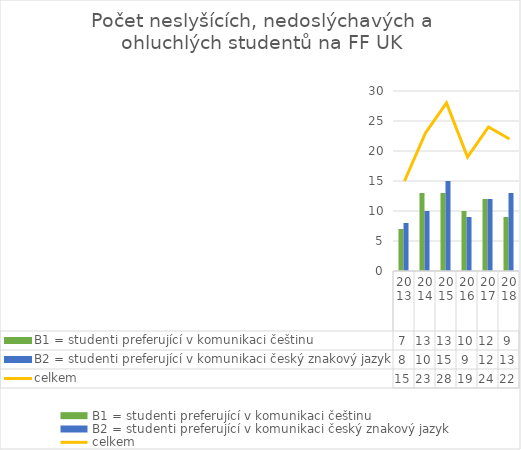
| Category | B1 = studenti preferující v komunikaci češtinu | B2 = studenti preferující v komunikaci český znakový jazyk |
|---|---|---|
| 2013.0 | 7 | 8 |
| 2014.0 | 13 | 10 |
| 2015.0 | 13 | 15 |
| 2016.0 | 10 | 9 |
| 2017.0 | 12 | 12 |
| 2018.0 | 9 | 13 |